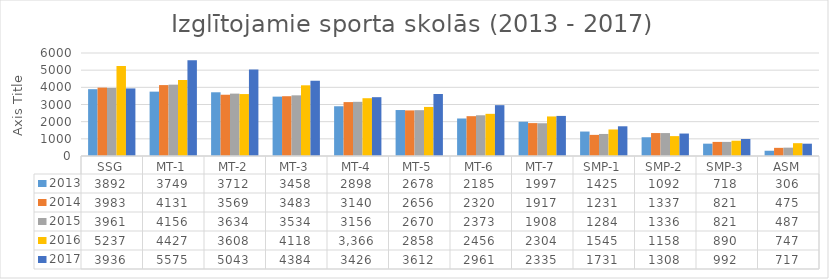
| Category | 2013 | 2014 | 2015 | 2016 | 2017 |
|---|---|---|---|---|---|
| SSG | 3892 | 3983 | 3961 | 5237 | 3936 |
| MT-1 | 3749 | 4131 | 4156 | 4427 | 5575 |
| MT-2 | 3712 | 3569 | 3634 | 3608 | 5043 |
| MT-3 | 3458 | 3483 | 3534 | 4118 | 4384 |
| MT-4 | 2898 | 3140 | 3156 | 3366 | 3426 |
| MT-5 | 2678 | 2656 | 2670 | 2858 | 3612 |
| MT-6 | 2185 | 2320 | 2373 | 2456 | 2961 |
| MT-7 | 1997 | 1917 | 1908 | 2304 | 2335 |
| SMP-1 | 1425 | 1231 | 1284 | 1545 | 1731 |
| SMP-2 | 1092 | 1337 | 1336 | 1158 | 1308 |
| SMP-3 | 718 | 821 | 821 | 890 | 992 |
| ASM | 306 | 475 | 487 | 747 | 717 |